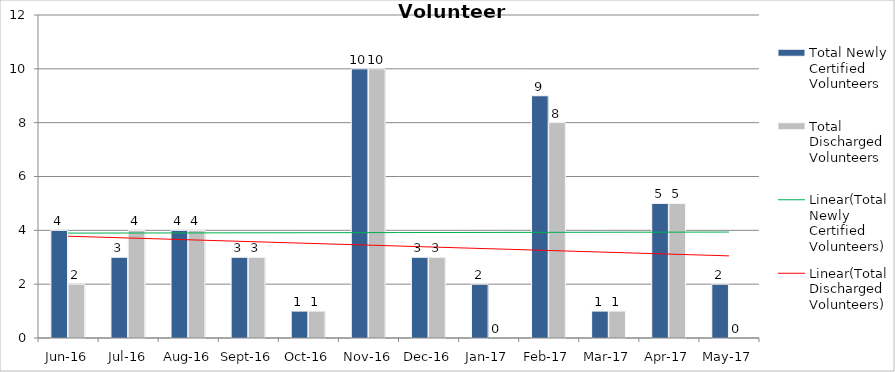
| Category | Total Newly Certified Volunteers | Total Discharged Volunteers |
|---|---|---|
| Jun-16 | 4 | 2 |
| Jul-16 | 3 | 4 |
| Aug-16 | 4 | 4 |
| Sep-16 | 3 | 3 |
| Oct-16 | 1 | 1 |
| Nov-16 | 10 | 10 |
| Dec-16 | 3 | 3 |
| Jan-17 | 2 | 0 |
| Feb-17 | 9 | 8 |
| Mar-17 | 1 | 1 |
| Apr-17 | 5 | 5 |
| May-17 | 2 | 0 |